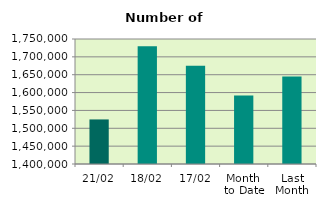
| Category | Series 0 |
|---|---|
| 21/02 | 1524786 |
| 18/02 | 1729852 |
| 17/02 | 1675148 |
| Month 
to Date | 1591693.867 |
| Last
Month | 1644892 |